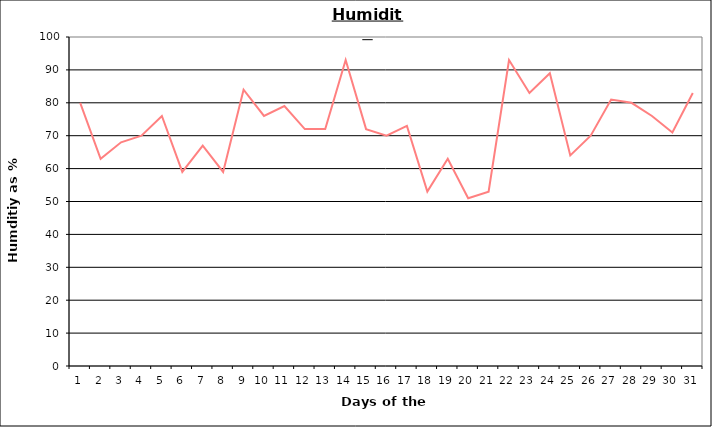
| Category | Series 0 |
|---|---|
| 0 | 80 |
| 1 | 63 |
| 2 | 68 |
| 3 | 70 |
| 4 | 76 |
| 5 | 59 |
| 6 | 67 |
| 7 | 59 |
| 8 | 84 |
| 9 | 76 |
| 10 | 79 |
| 11 | 72 |
| 12 | 72 |
| 13 | 93 |
| 14 | 72 |
| 15 | 70 |
| 16 | 73 |
| 17 | 53 |
| 18 | 63 |
| 19 | 51 |
| 20 | 53 |
| 21 | 93 |
| 22 | 83 |
| 23 | 89 |
| 24 | 64 |
| 25 | 70 |
| 26 | 81 |
| 27 | 80 |
| 28 | 76 |
| 29 | 71 |
| 30 | 83 |